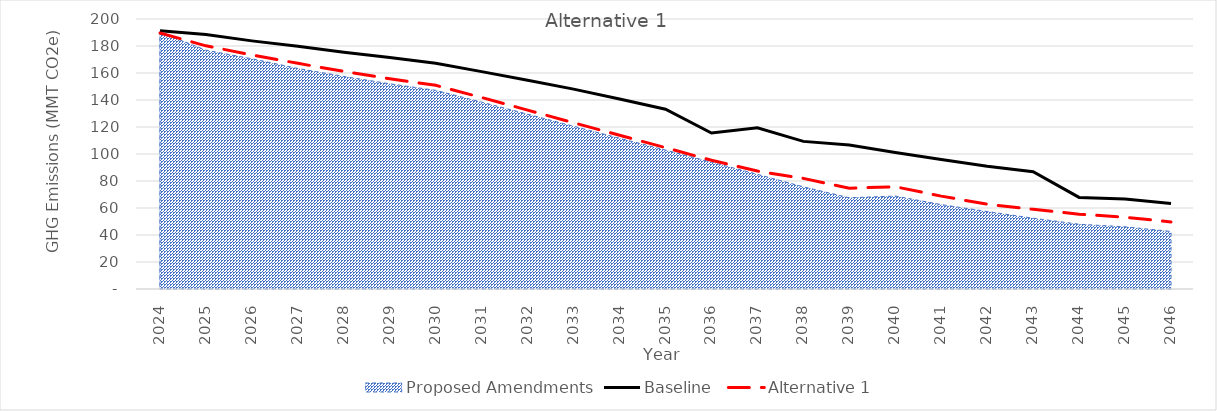
| Category | Baseline  | Alternative 1 |
|---|---|---|
| 2024.0 | 191.357 | 189.635 |
| 2025.0 | 188.439 | 180.126 |
| 2026.0 | 183.798 | 173.434 |
| 2027.0 | 179.753 | 167.162 |
| 2028.0 | 175.419 | 161.192 |
| 2029.0 | 171.532 | 155.766 |
| 2030.0 | 167.16 | 150.881 |
| 2031.0 | 161.031 | 141.837 |
| 2032.0 | 154.691 | 132.53 |
| 2033.0 | 148.038 | 123.157 |
| 2034.0 | 140.791 | 113.87 |
| 2035.0 | 133.188 | 104.682 |
| 2036.0 | 115.548 | 95.353 |
| 2037.0 | 119.355 | 87.351 |
| 2038.0 | 109.345 | 81.923 |
| 2039.0 | 106.623 | 74.696 |
| 2040.0 | 101.123 | 75.752 |
| 2041.0 | 95.876 | 68.796 |
| 2042.0 | 90.88 | 62.788 |
| 2043.0 | 86.822 | 58.99 |
| 2044.0 | 67.842 | 55.414 |
| 2045.0 | 66.703 | 53.133 |
| 2046.0 | 63.352 | 49.694 |